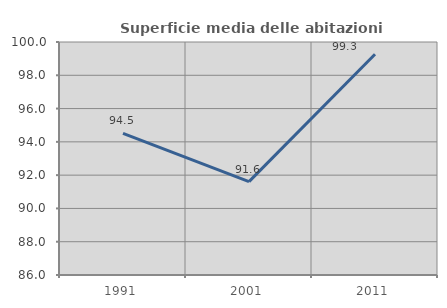
| Category | Superficie media delle abitazioni occupate |
|---|---|
| 1991.0 | 94.516 |
| 2001.0 | 91.613 |
| 2011.0 | 99.262 |